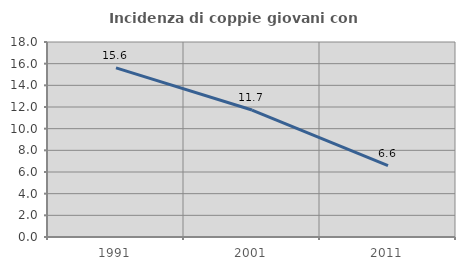
| Category | Incidenza di coppie giovani con figli |
|---|---|
| 1991.0 | 15.61 |
| 2001.0 | 11.718 |
| 2011.0 | 6.579 |